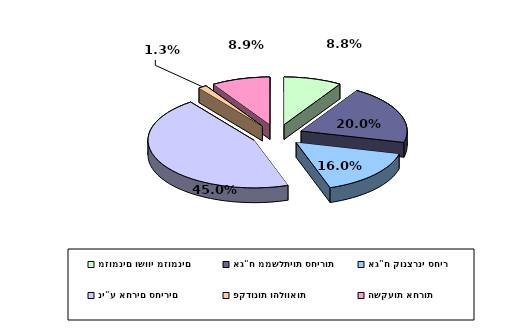
| Category | Series 0 |
|---|---|
| מזומנים ושווי מזומנים | 0.088 |
| אג"ח ממשלתיות סחירות | 0.2 |
| אג"ח קונצרני סחיר | 0.16 |
| ני"ע אחרים סחירים | 0.45 |
| פקדונות והלוואות | 0.013 |
| השקעות אחרות | 0.089 |